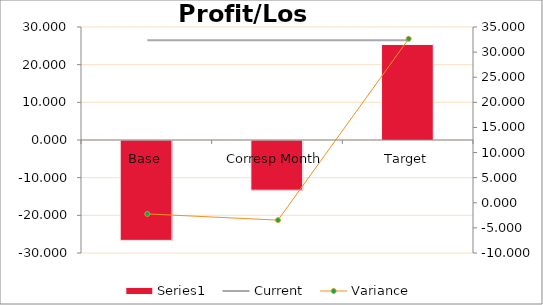
| Category | Series 0 |
|---|---|
| Base | -26.512 |
| Corresp Month | -13.202 |
| Target | 25.347 |